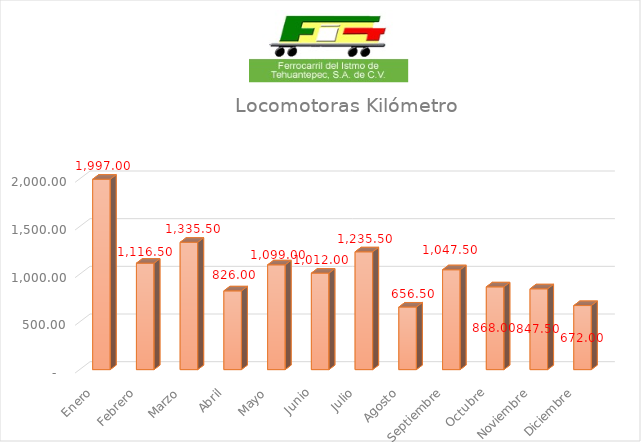
| Category | Series 0 |
|---|---|
| Enero | 1997 |
| Febrero | 1116.5 |
| Marzo | 1335.5 |
| Abril | 826 |
| Mayo | 1099 |
| Junio | 1012 |
| Julio | 1235.5 |
| Agosto | 656.5 |
| Septiembre | 1047.5 |
| Octubre | 868 |
| Noviembre | 847.5 |
| Diciembre | 672 |